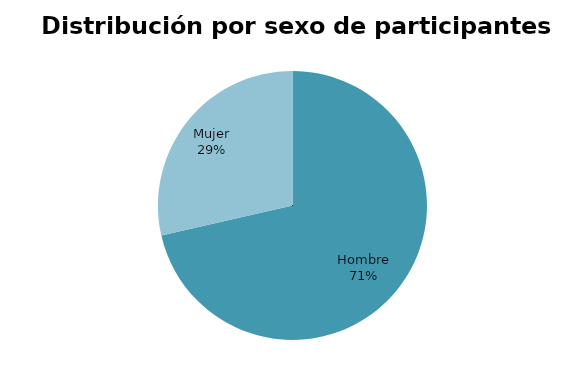
| Category | Series 0 |
|---|---|
| Hombre | 10 |
| Mujer | 4 |